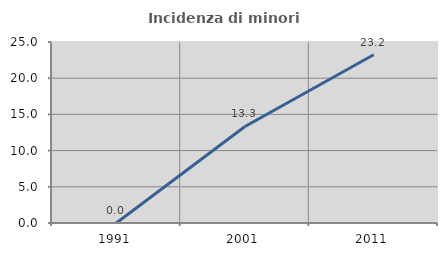
| Category | Incidenza di minori stranieri |
|---|---|
| 1991.0 | 0 |
| 2001.0 | 13.333 |
| 2011.0 | 23.232 |